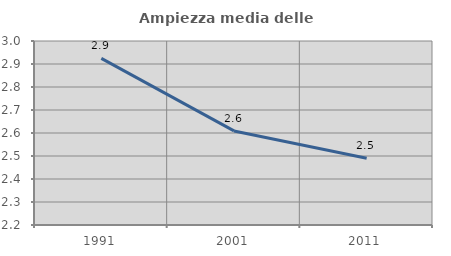
| Category | Ampiezza media delle famiglie |
|---|---|
| 1991.0 | 2.925 |
| 2001.0 | 2.609 |
| 2011.0 | 2.49 |